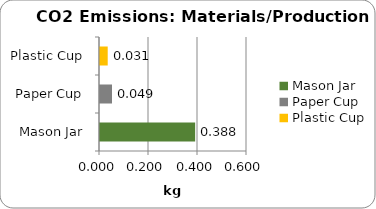
| Category | Series 0 |
|---|---|
| Mason Jar | 0.388 |
| Paper Cup | 0.049 |
| Plastic Cup | 0.031 |